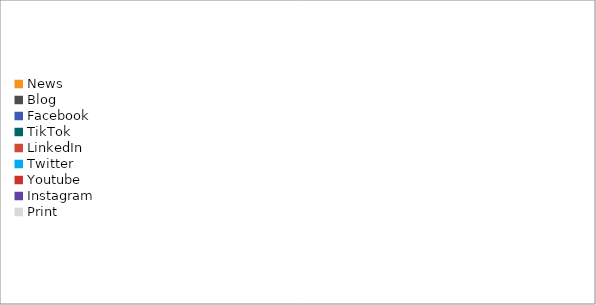
| Category | Series 0 |
|---|---|
| News | 0 |
| Blog | 0 |
| Facebook | 0 |
| TikTok | 0 |
| LinkedIn | 0 |
| Twitter | 0 |
| Youtube | 0 |
| Instagram | 0 |
| Print | 0 |